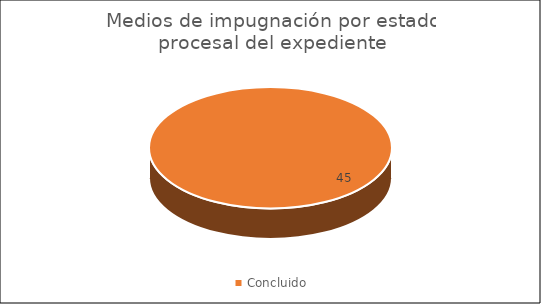
| Category | Medios de impugnación por estado procesal del expediente |
|---|---|
| Concluido | 45 |